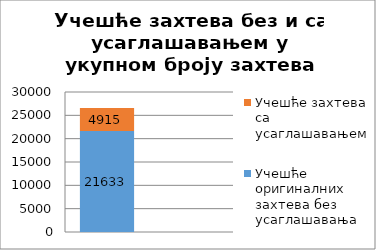
| Category | Учешће оригиналних захтева без усаглашавања | Учешће захтева са усаглашавањем |
|---|---|---|
| 0 | 21633 | 4915 |
| 1 | 0.815 | 0.185 |